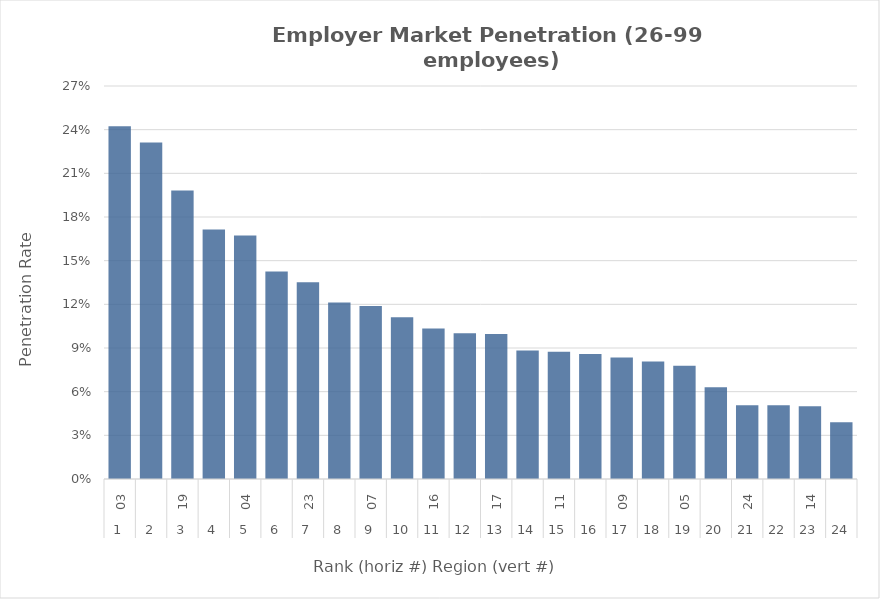
| Category | Rate |
|---|---|
| 0 | 0.242 |
| 1 | 0.231 |
| 2 | 0.198 |
| 3 | 0.171 |
| 4 | 0.167 |
| 5 | 0.143 |
| 6 | 0.135 |
| 7 | 0.121 |
| 8 | 0.119 |
| 9 | 0.111 |
| 10 | 0.103 |
| 11 | 0.1 |
| 12 | 0.1 |
| 13 | 0.088 |
| 14 | 0.087 |
| 15 | 0.086 |
| 16 | 0.083 |
| 17 | 0.081 |
| 18 | 0.078 |
| 19 | 0.063 |
| 20 | 0.051 |
| 21 | 0.051 |
| 22 | 0.05 |
| 23 | 0.039 |